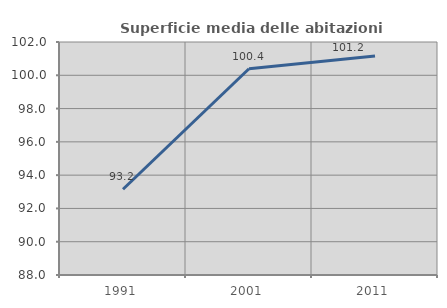
| Category | Superficie media delle abitazioni occupate |
|---|---|
| 1991.0 | 93.153 |
| 2001.0 | 100.394 |
| 2011.0 | 101.161 |